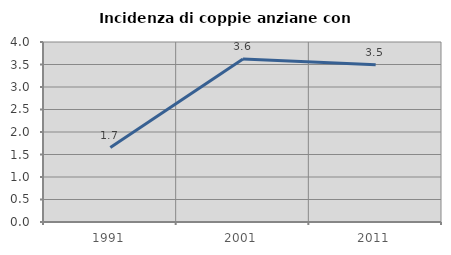
| Category | Incidenza di coppie anziane con figli |
|---|---|
| 1991.0 | 1.653 |
| 2001.0 | 3.62 |
| 2011.0 | 3.493 |